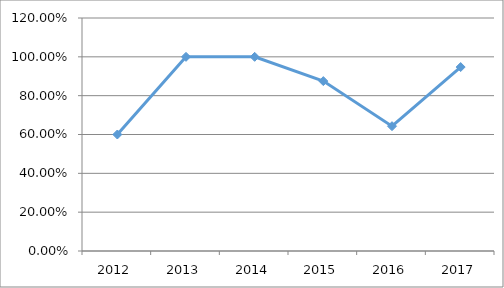
| Category | DIAP-R1O12 |
|---|---|
| 2012.0 | 0.6 |
| 2013.0 | 1 |
| 2014.0 | 1 |
| 2015.0 | 0.875 |
| 2016.0 | 0.643 |
| 2017.0 | 0.947 |